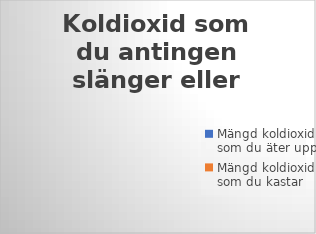
| Category | Series 0 |
|---|---|
| Mängd koldioxid som du äter upp | 0 |
| Mängd koldioxid som du kastar | 0 |